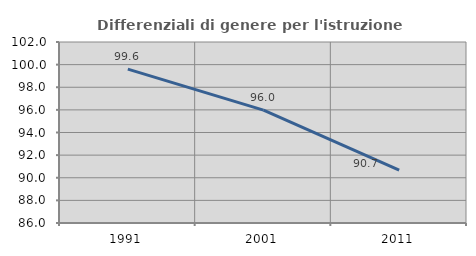
| Category | Differenziali di genere per l'istruzione superiore |
|---|---|
| 1991.0 | 99.604 |
| 2001.0 | 95.978 |
| 2011.0 | 90.681 |